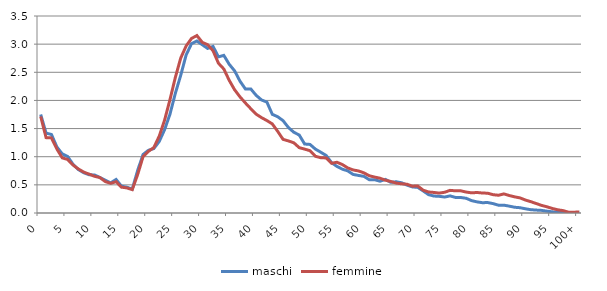
| Category | maschi | femmine |
|---|---|---|
| 0 | 1.75 | 1.715 |
| 1 | 1.419 | 1.339 |
| 2 | 1.395 | 1.334 |
| 3 | 1.174 | 1.138 |
| 4 | 1.05 | 0.98 |
| 5 | 1.005 | 0.951 |
| 6 | 0.865 | 0.852 |
| 7 | 0.771 | 0.782 |
| 8 | 0.715 | 0.726 |
| 9 | 0.679 | 0.69 |
| 10 | 0.676 | 0.652 |
| 11 | 0.631 | 0.63 |
| 12 | 0.583 | 0.557 |
| 13 | 0.535 | 0.527 |
| 14 | 0.596 | 0.556 |
| 15 | 0.477 | 0.459 |
| 16 | 0.459 | 0.446 |
| 17 | 0.425 | 0.415 |
| 18 | 0.755 | 0.683 |
| 19 | 1.04 | 0.999 |
| 20 | 1.113 | 1.095 |
| 21 | 1.145 | 1.162 |
| 22 | 1.269 | 1.364 |
| 23 | 1.48 | 1.649 |
| 24 | 1.755 | 2.013 |
| 25 | 2.127 | 2.409 |
| 26 | 2.447 | 2.753 |
| 27 | 2.806 | 2.967 |
| 28 | 3.008 | 3.101 |
| 29 | 3.056 | 3.153 |
| 30 | 2.99 | 3.032 |
| 31 | 2.924 | 2.99 |
| 32 | 2.96 | 2.882 |
| 33 | 2.774 | 2.661 |
| 34 | 2.8 | 2.558 |
| 35 | 2.642 | 2.357 |
| 36 | 2.526 | 2.19 |
| 37 | 2.343 | 2.064 |
| 38 | 2.205 | 1.955 |
| 39 | 2.205 | 1.853 |
| 40 | 2.091 | 1.756 |
| 41 | 2.008 | 1.694 |
| 42 | 1.97 | 1.642 |
| 43 | 1.753 | 1.583 |
| 44 | 1.71 | 1.451 |
| 45 | 1.641 | 1.308 |
| 46 | 1.518 | 1.28 |
| 47 | 1.434 | 1.247 |
| 48 | 1.385 | 1.161 |
| 49 | 1.226 | 1.135 |
| 50 | 1.218 | 1.107 |
| 51 | 1.135 | 1.008 |
| 52 | 1.08 | 0.982 |
| 53 | 1.022 | 0.978 |
| 54 | 0.894 | 0.883 |
| 55 | 0.828 | 0.901 |
| 56 | 0.779 | 0.861 |
| 57 | 0.749 | 0.801 |
| 58 | 0.686 | 0.765 |
| 59 | 0.667 | 0.747 |
| 60 | 0.652 | 0.714 |
| 61 | 0.592 | 0.662 |
| 62 | 0.592 | 0.639 |
| 63 | 0.565 | 0.618 |
| 64 | 0.597 | 0.582 |
| 65 | 0.545 | 0.56 |
| 66 | 0.555 | 0.531 |
| 67 | 0.537 | 0.519 |
| 68 | 0.496 | 0.511 |
| 69 | 0.463 | 0.477 |
| 70 | 0.455 | 0.479 |
| 71 | 0.393 | 0.406 |
| 72 | 0.327 | 0.374 |
| 73 | 0.301 | 0.365 |
| 74 | 0.296 | 0.353 |
| 75 | 0.284 | 0.369 |
| 76 | 0.304 | 0.402 |
| 77 | 0.277 | 0.394 |
| 78 | 0.275 | 0.394 |
| 79 | 0.261 | 0.372 |
| 80 | 0.22 | 0.358 |
| 81 | 0.198 | 0.364 |
| 82 | 0.183 | 0.355 |
| 83 | 0.186 | 0.351 |
| 84 | 0.167 | 0.325 |
| 85 | 0.138 | 0.315 |
| 86 | 0.139 | 0.339 |
| 87 | 0.122 | 0.31 |
| 88 | 0.102 | 0.287 |
| 89 | 0.094 | 0.268 |
| 90 | 0.075 | 0.23 |
| 91 | 0.059 | 0.201 |
| 92 | 0.052 | 0.168 |
| 93 | 0.046 | 0.135 |
| 94 | 0.032 | 0.11 |
| 95 | 0.021 | 0.08 |
| 96 | 0.013 | 0.057 |
| 97 | 0.01 | 0.042 |
| 98 | 0.003 | 0.015 |
| 99 | 0.003 | 0.013 |
| 100+ | 0.004 | 0.02 |